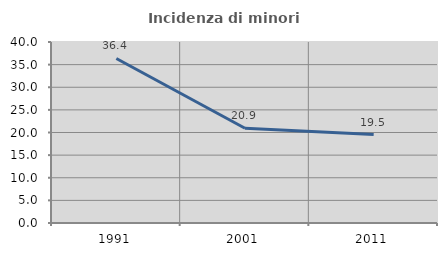
| Category | Incidenza di minori stranieri |
|---|---|
| 1991.0 | 36.364 |
| 2001.0 | 20.93 |
| 2011.0 | 19.55 |